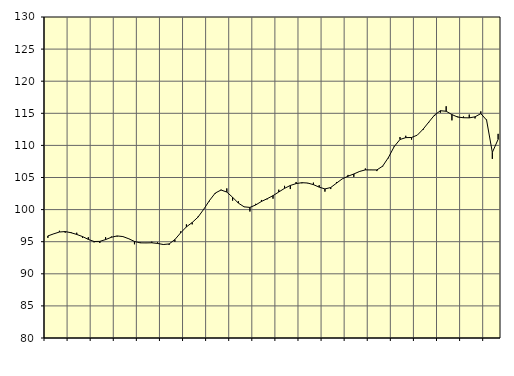
| Category | Piggar | Samtliga fast anställda (inkl. fast anställda utomlands) |
|---|---|---|
| nan | 95.6 | 95.9 |
| 1.0 | 96.2 | 96.22 |
| 1.0 | 96.7 | 96.51 |
| 1.0 | 96.4 | 96.58 |
| nan | 96.5 | 96.4 |
| 2.0 | 96.4 | 96.13 |
| 2.0 | 95.6 | 95.8 |
| 2.0 | 95.7 | 95.36 |
| nan | 94.9 | 95.03 |
| 3.0 | 94.8 | 95.05 |
| 3.0 | 95.7 | 95.33 |
| 3.0 | 95.8 | 95.69 |
| nan | 95.8 | 95.9 |
| 4.0 | 95.8 | 95.8 |
| 4.0 | 95.5 | 95.46 |
| 4.0 | 94.6 | 95.04 |
| nan | 94.9 | 94.82 |
| 5.0 | 94.8 | 94.81 |
| 5.0 | 95 | 94.83 |
| 5.0 | 94.9 | 94.73 |
| nan | 94.6 | 94.56 |
| 6.0 | 94.5 | 94.65 |
| 6.0 | 95 | 95.33 |
| 6.0 | 96.6 | 96.38 |
| nan | 97.7 | 97.31 |
| 7.0 | 97.7 | 97.99 |
| 7.0 | 98.9 | 98.82 |
| 7.0 | 100.1 | 100.05 |
| nan | 101.3 | 101.42 |
| 8.0 | 102.5 | 102.58 |
| 8.0 | 103.1 | 103.05 |
| 8.0 | 103.3 | 102.73 |
| nan | 101.4 | 101.92 |
| 9.0 | 101.3 | 101.01 |
| 9.0 | 100.4 | 100.43 |
| 9.0 | 99.7 | 100.34 |
| nan | 100.9 | 100.72 |
| 10.0 | 101.5 | 101.27 |
| 10.0 | 101.6 | 101.7 |
| 10.0 | 101.7 | 102.17 |
| nan | 103.1 | 102.74 |
| 11.0 | 103.7 | 103.31 |
| 11.0 | 103.2 | 103.76 |
| 11.0 | 104.3 | 104.05 |
| nan | 104.1 | 104.19 |
| 12.0 | 104.1 | 104.14 |
| 12.0 | 104.2 | 103.89 |
| 12.0 | 103.8 | 103.5 |
| nan | 102.8 | 103.22 |
| 13.0 | 103.2 | 103.44 |
| 13.0 | 104.3 | 104.12 |
| 13.0 | 104.8 | 104.79 |
| nan | 105.4 | 105.2 |
| 14.0 | 105.1 | 105.55 |
| 14.0 | 105.9 | 105.94 |
| 14.0 | 106.4 | 106.19 |
| nan | 106.2 | 106.18 |
| 15.0 | 106 | 106.18 |
| 15.0 | 106.7 | 106.77 |
| 15.0 | 108 | 108.12 |
| nan | 109.9 | 109.82 |
| 16.0 | 111.3 | 110.92 |
| 16.0 | 111.5 | 111.21 |
| 16.0 | 110.9 | 111.23 |
| nan | 111.6 | 111.6 |
| 17.0 | 112.4 | 112.52 |
| 17.0 | 113.6 | 113.64 |
| 17.0 | 114.6 | 114.74 |
| nan | 115.1 | 115.4 |
| 18.0 | 116.1 | 115.32 |
| 18.0 | 113.9 | 114.8 |
| 18.0 | 114.5 | 114.41 |
| nan | 114.5 | 114.31 |
| 19.0 | 114.8 | 114.29 |
| 19.0 | 114.2 | 114.45 |
| 19.0 | 115.3 | 114.95 |
| nan | 114 | 113.95 |
| 20.0 | 107.9 | 108.91 |
| 20.0 | 111.8 | 110.94 |